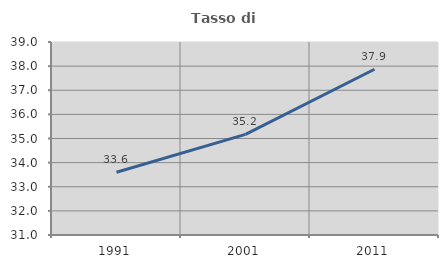
| Category | Tasso di occupazione   |
|---|---|
| 1991.0 | 33.602 |
| 2001.0 | 35.171 |
| 2011.0 | 37.871 |